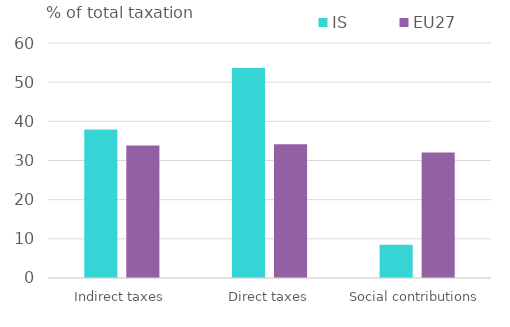
| Category | IS | EU27 |
|---|---|---|
| Indirect taxes | 37.926 | 33.811 |
| Direct taxes | 53.611 | 34.133 |
| Social contributions | 8.464 | 32.056 |